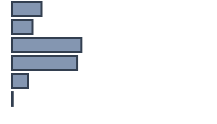
| Category | Series 0 |
|---|---|
| 0 | 14.649 |
| 1 | 10.173 |
| 2 | 34.495 |
| 3 | 32.369 |
| 4 | 7.945 |
| 5 | 0.37 |